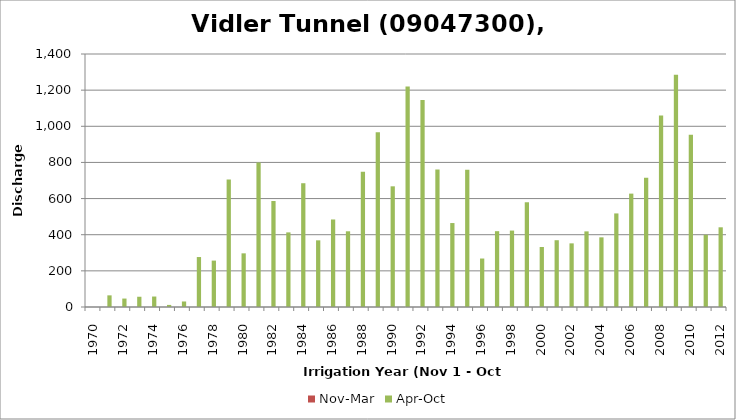
| Category | Nov-Mar | Apr-Oct |
|---|---|---|
| 1970.0 | 0 | 0 |
| 1971.0 | 0 | 64.46 |
| 1972.0 | 0 | 46.71 |
| 1973.0 | 0 | 56.73 |
| 1974.0 | 0 | 57.92 |
| 1975.0 | 0 | 11.5 |
| 1976.0 | 0 | 30.55 |
| 1977.0 | 0 | 276.48 |
| 1978.0 | 0 | 256.76 |
| 1979.0 | 0 | 705.52 |
| 1980.0 | 0 | 296.93 |
| 1981.0 | 0 | 799.76 |
| 1982.0 | 0 | 586.48 |
| 1983.0 | 0 | 412.86 |
| 1984.0 | 0 | 684.94 |
| 1985.0 | 0 | 368.91 |
| 1986.0 | 0 | 484.31 |
| 1987.0 | 0 | 418.94 |
| 1988.0 | 0 | 748.13 |
| 1989.0 | 0 | 967.15 |
| 1990.0 | 0 | 667.82 |
| 1991.0 | 0 | 1220.78 |
| 1992.0 | 0 | 1145.65 |
| 1993.0 | 0 | 760.9 |
| 1994.0 | 0 | 464.54 |
| 1995.0 | 0 | 759.63 |
| 1996.0 | 0 | 268.25 |
| 1997.0 | 0 | 419.52 |
| 1998.0 | 0 | 422.97 |
| 1999.0 | 0 | 579.58 |
| 2000.0 | 0 | 332.14 |
| 2001.0 | 0 | 369.55 |
| 2002.0 | 0 | 352.15 |
| 2003.0 | 0 | 418.46 |
| 2004.0 | 0 | 385.48 |
| 2005.0 | 0 | 517.8 |
| 2006.0 | 0 | 627.38 |
| 2007.0 | 0 | 714.65 |
| 2008.0 | 0 | 1059.79 |
| 2009.0 | 0 | 1284.72 |
| 2010.0 | 0 | 953.34 |
| 2011.0 | 0 | 399.55 |
| 2012.0 | 0 | 441 |